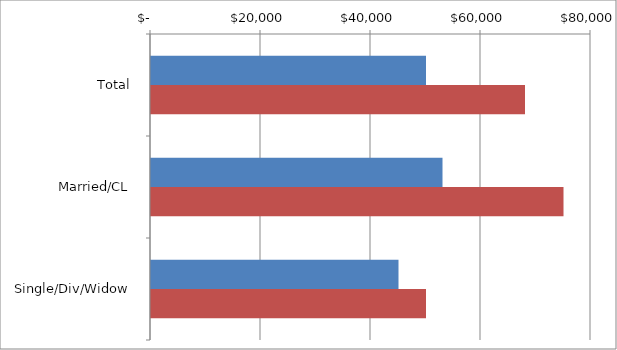
| Category | Series 0 | Series 1 |
|---|---|---|
| Total | 50000 | 68000 |
|  Married/CL  | 53000 | 75000 |
|  Single/Div/Widow  | 45000 | 50000 |